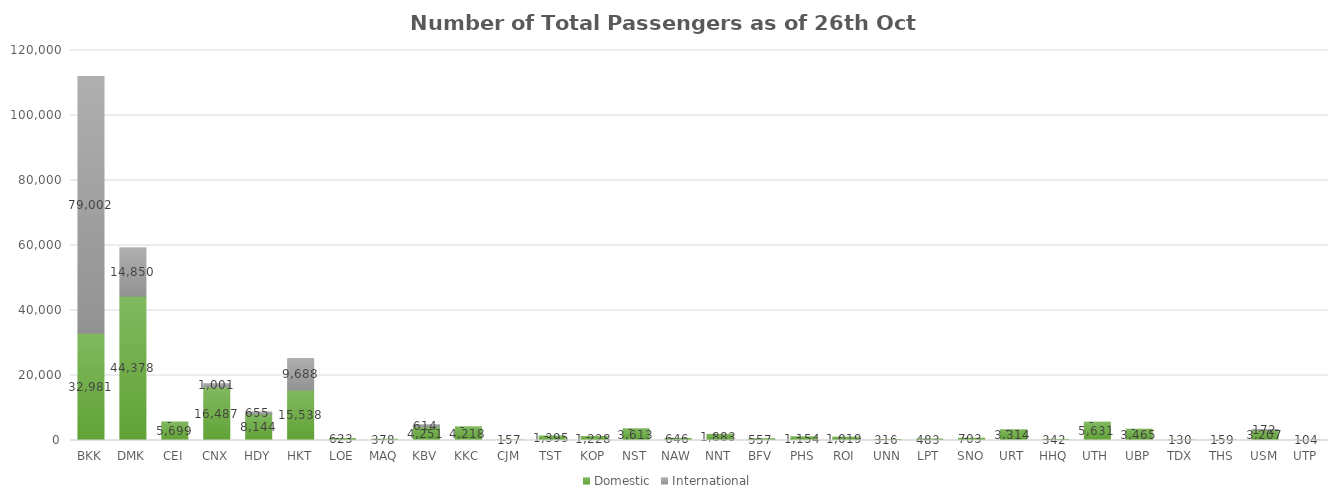
| Category | Domestic | International |
|---|---|---|
| BKK | 32981 | 79002 |
| DMK | 44378 | 14850 |
| CEI | 5699 | 0 |
| CNX | 16487 | 1001 |
| HDY | 8144 | 655 |
| HKT | 15538 | 9688 |
| LOE | 623 | 0 |
| MAQ | 378 | 0 |
| KBV | 4251 | 614 |
| KKC | 4218 | 0 |
| CJM | 157 | 0 |
| TST | 1395 | 0 |
| KOP | 1228 | 0 |
| NST | 3613 | 0 |
| NAW | 646 | 0 |
| NNT | 1883 | 0 |
| BFV | 557 | 0 |
| PHS | 1154 | 0 |
| ROI | 1019 | 0 |
| UNN | 316 | 0 |
| LPT | 483 | 0 |
| SNO | 703 | 0 |
| URT | 3314 | 0 |
| HHQ | 342 | 0 |
| UTH | 5631 | 0 |
| UBP | 3465 | 0 |
| TDX | 130 | 0 |
| THS | 159 | 0 |
| USM | 3207 | 172 |
| UTP | 104 | 0 |